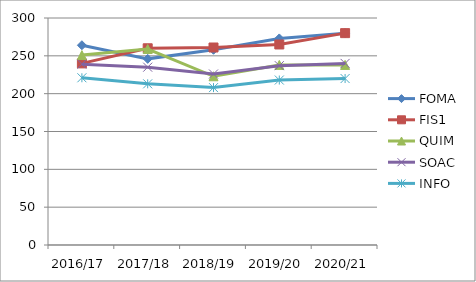
| Category | FOMA | FIS1 | QUIM | SOAC | INFO |
|---|---|---|---|---|---|
| 2016/17 | 264 | 240 | 251 | 239 | 221 |
| 2017/18 | 246 | 260 | 259 | 235 | 213 |
| 2018/19 | 258 | 261 | 223 | 226 | 208 |
| 2019/20 | 273 | 265 | 238 | 237 | 218 |
| 2020/21 | 280 | 280 | 238 | 240 | 220 |